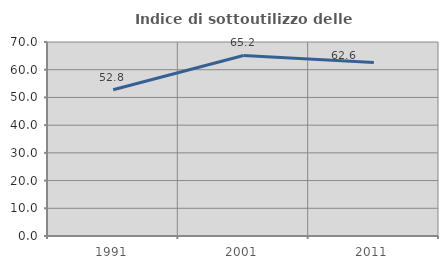
| Category | Indice di sottoutilizzo delle abitazioni  |
|---|---|
| 1991.0 | 52.793 |
| 2001.0 | 65.156 |
| 2011.0 | 62.609 |